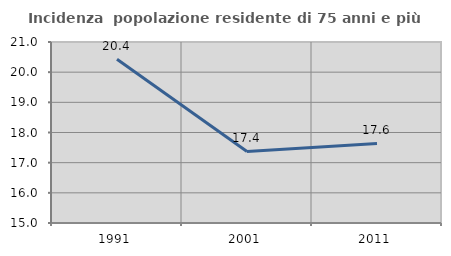
| Category | Incidenza  popolazione residente di 75 anni e più |
|---|---|
| 1991.0 | 20.426 |
| 2001.0 | 17.371 |
| 2011.0 | 17.638 |